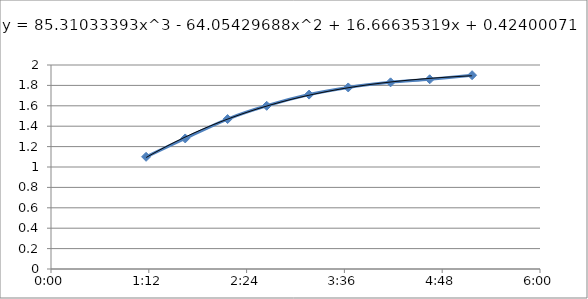
| Category | hodnota |
|---|---|
| 0.04861111111111111 | 1.1 |
| 0.06861111111111111 | 1.28 |
| 0.0902777777777778 | 1.47 |
| 0.11027777777777781 | 1.6 |
| 0.131944444444444 | 1.71 |
| 0.151944444444444 | 1.78 |
| 0.173611111111111 | 1.83 |
| 0.19361111111111098 | 1.86 |
| 0.215277777777778 | 1.9 |